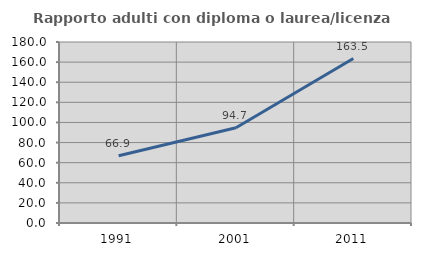
| Category | Rapporto adulti con diploma o laurea/licenza media  |
|---|---|
| 1991.0 | 66.934 |
| 2001.0 | 94.66 |
| 2011.0 | 163.546 |